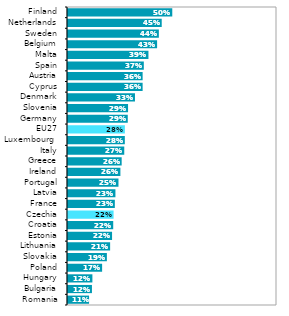
| Category | Series 0 |
|---|---|
| Romania | 0.106 |
| Bulgaria | 0.119 |
| Hungary | 0.121 |
| Poland | 0.168 |
| Slovakia | 0.191 |
| Lithuania | 0.206 |
| Estonia | 0.216 |
| Croatia | 0.221 |
| Czechia | 0.223 |
| France | 0.229 |
| Latvia | 0.232 |
| Portugal | 0.246 |
| Ireland | 0.255 |
| Greece | 0.262 |
| Italy | 0.274 |
| Luxembourg  | 0.277 |
| EU27 | 0.277 |
| Germany | 0.291 |
| Slovenia | 0.292 |
| Denmark | 0.325 |
| Cyprus | 0.362 |
| Austria | 0.362 |
| Spain | 0.368 |
| Malta | 0.39 |
| Belgium | 0.431 |
| Sweden | 0.44 |
| Netherlands | 0.453 |
| Finland | 0.504 |